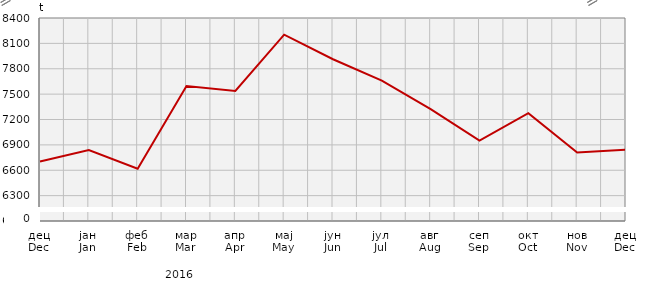
| Category | Прикупљање крављег млијека
Collecting of cow’s milk |
|---|---|
| дец
Dec | 6703.986 |
| јан
Jan | 6839.677 |
| феб
Feb | 6618.5 |
| мар
Mar | 7595.98 |
| апр
Apr | 7537.768 |
| мај
May | 8202.4 |
| јун
Jun | 7912.4 |
| јул
Jul | 7659 |
| авг
Aug | 7323 |
| сеп
Sep | 6949.6 |
| окт
Oct | 7275 |
| нов
Nov | 6810.8 |
| дец
Dec | 6844 |